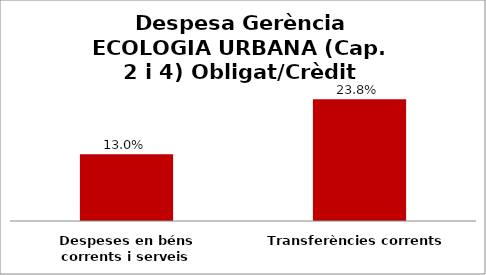
| Category | Series 0 |
|---|---|
| Despeses en béns corrents i serveis | 0.13 |
| Transferències corrents | 0.238 |